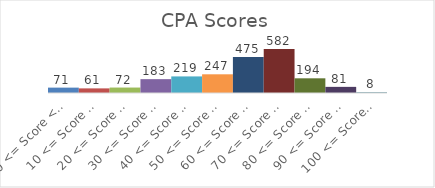
| Category | Frequency (Count) |
|---|---|
| 0 <= Score < 10 | 71 |
| 10 <= Score < 20 | 61 |
| 20 <= Score < 30 | 72 |
| 30 <= Score < 40 | 183 |
| 40 <= Score < 50 | 219 |
| 50 <= Score < 60 | 247 |
| 60 <= Score < 70 | 475 |
| 70 <= Score < 80 | 582 |
| 80 <= Score < 90 | 194 |
| 90 <= Score < 100 | 81 |
| 100 <= Score < 110 | 8 |